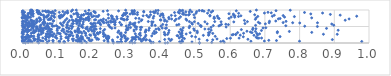
| Category | Series 0 |
|---|---|
| 0.5119025877408926 | 0.001 |
| 0.4126539866589853 | 0.002 |
| 0.009565070195917147 | 0.003 |
| 0.5110437259262518 | 0.004 |
| 0.26343760605690314 | 0.005 |
| 0.04818512540377783 | 0.006 |
| 0.31847032164182726 | 0.007 |
| 0.4196648750307523 | 0.008 |
| 0.37221815655606694 | 0.009 |
| 0.3252234285979464 | 0.01 |
| 0.4578985301840214 | 0.011 |
| 0.1725142587305596 | 0.012 |
| 0.0037070343712594517 | 0.013 |
| 0.0728381030565067 | 0.014 |
| 0.18586488468396364 | 0.015 |
| 0.5468149584931802 | 0.016 |
| 0.3110965996179899 | 0.017 |
| 0.3782162829624918 | 0.018 |
| 0.018305680623724792 | 0.019 |
| 0.07234310696253618 | 0.02 |
| 0.27947726100723885 | 0.021 |
| 0.5829646561322925 | 0.022 |
| 0.12295013277099939 | 0.023 |
| 0.274148199250739 | 0.024 |
| 0.24808586120000017 | 0.025 |
| 0.10850868623535385 | 0.026 |
| 0.1203393513211631 | 0.027 |
| 0.0896639272993858 | 0.028 |
| 0.28689535963270074 | 0.029 |
| 0.02921057819102696 | 0.03 |
| 0.16715190988454232 | 0.031 |
| 0.48984421801418226 | 0.032 |
| 0.04484551768862694 | 0.033 |
| 0.01579565165165343 | 0.034 |
| 0.4542212703960004 | 0.035 |
| 0.025391776370436273 | 0.036 |
| 0.016611433516440854 | 0.037 |
| 0.4627031396345181 | 0.038 |
| 0.16830707266852046 | 0.039 |
| 0.39629480736686873 | 0.04 |
| 0.5727819457750162 | 0.041 |
| 0.16057743324149176 | 0.042 |
| 0.285822041818848 | 0.043 |
| 0.12163234444274439 | 0.044 |
| 0.9790710817109156 | 0.045 |
| 0.3445888609127008 | 0.046 |
| 0.26216488195021453 | 0.047 |
| 0.37046815945160294 | 0.048 |
| 0.0016464650899225299 | 0.049 |
| 0.10656667648574371 | 0.05 |
| 0.006076138489974972 | 0.051 |
| 0.29850312595106554 | 0.052 |
| 0.6596730757829257 | 0.053 |
| 0.7997433507426633 | 0.054 |
| 0.10856643164775959 | 0.055 |
| 0.24748910148861322 | 0.056 |
| 0.4608443652437571 | 0.057 |
| 0.06047659159965289 | 0.058 |
| 0.6985067056871446 | 0.059 |
| 0.005953391851341842 | 0.06 |
| 0.0013565403542534341 | 0.061 |
| 0.5796616221465702 | 0.062 |
| 0.1804670981968877 | 0.063 |
| 0.019672254525324374 | 0.064 |
| 0.19841442980352123 | 0.065 |
| 0.1647067813303495 | 0.066 |
| 0.054708043080989394 | 0.067 |
| 0.14738743690725672 | 0.068 |
| 0.08935802420370768 | 0.069 |
| 0.07789127826838671 | 0.07 |
| 0.2367691939130765 | 0.071 |
| 0.4279017837008784 | 0.072 |
| 0.001234815517246652 | 0.073 |
| 0.7333494051140961 | 0.074 |
| 0.1333625994295932 | 0.075 |
| 0.1556380530285394 | 0.076 |
| 0.31589857928697695 | 0.077 |
| 0.08907305338222854 | 0.078 |
| 0.03489830999570762 | 0.079 |
| 0.19476019123073157 | 0.08 |
| 0.7112491979636713 | 0.081 |
| 0.5337613130346864 | 0.082 |
| 0.4613010239611775 | 0.083 |
| 0.36767456002003196 | 0.084 |
| 0.024291158913326137 | 0.085 |
| 0.19353175272078613 | 0.086 |
| 0.35659216999408416 | 0.087 |
| 0.0504433772494215 | 0.088 |
| 0.037685639439198455 | 0.089 |
| 0.2019842502042744 | 0.09 |
| 0.0022177023693992896 | 0.091 |
| 0.26083696338702 | 0.092 |
| 0.30212136470536155 | 0.093 |
| 0.3490182135243095 | 0.094 |
| 0.03702994257538821 | 0.095 |
| 0.5496973995938144 | 0.096 |
| 0.16431018351470741 | 0.097 |
| 0.00936817803683666 | 0.098 |
| 0.17103427520904388 | 0.099 |
| 0.3423506517497918 | 0.1 |
| 0.35878481380429406 | 0.101 |
| 0.2466917180414053 | 0.102 |
| 0.8944369424244668 | 0.103 |
| 0.06924895719642772 | 0.104 |
| 0.32726675822444207 | 0.105 |
| 0.43122927210652023 | 0.106 |
| 0.41127632143356513 | 0.107 |
| 0.019184857617721398 | 0.108 |
| 0.04431614382526744 | 0.109 |
| 0.28511302120442533 | 0.11 |
| 0.21589934618522266 | 0.111 |
| 0.2206314947919599 | 0.112 |
| 0.6510553493207257 | 0.113 |
| 0.011408317524876598 | 0.114 |
| 0.1618849035566547 | 0.115 |
| 0.3195991598963953 | 0.116 |
| 0.5105287988795942 | 0.117 |
| 0.3375737268340092 | 0.118 |
| 0.1754787284788721 | 0.119 |
| 0.14525638391060747 | 0.12 |
| 0.046558848661996347 | 0.121 |
| 0.14829771224872174 | 0.122 |
| 0.5620073145155606 | 0.123 |
| 0.30055819434844294 | 0.124 |
| 0.42327753017190967 | 0.125 |
| 0.11259605728469026 | 0.126 |
| 0.03651286200454346 | 0.127 |
| 0.0678462303275696 | 0.128 |
| 0.13300506415104935 | 0.129 |
| 0.35029162363015987 | 0.13 |
| 0.3402792603256351 | 0.131 |
| 0.3047734682660579 | 0.132 |
| 0.46808479414933096 | 0.133 |
| 0.5901718343891207 | 0.134 |
| 0.03350304918064729 | 0.135 |
| 0.35128403105923384 | 0.136 |
| 0.24866063459613566 | 0.137 |
| 0.002175744603686815 | 0.138 |
| 0.2169820490102558 | 0.139 |
| 0.243396539881631 | 0.14 |
| 0.32363610158967593 | 0.141 |
| 0.16574320402932008 | 0.142 |
| 0.10037754382586764 | 0.143 |
| 0.19315776367517873 | 0.144 |
| 0.6008149948747821 | 0.145 |
| 0.17249901423390793 | 0.146 |
| 0.6825538331252522 | 0.147 |
| 0.6256434530778168 | 0.148 |
| 0.2969572194009828 | 0.149 |
| 0.6779118630819716 | 0.15 |
| 0.6904783352809722 | 0.151 |
| 0.32561454310275517 | 0.152 |
| 0.45317856173937 | 0.153 |
| 0.05988923456390162 | 0.154 |
| 0.18870209021765158 | 0.155 |
| 0.25008428494351215 | 0.156 |
| 0.1707601973236729 | 0.157 |
| 0.010969449563899175 | 0.158 |
| 0.011510134957108684 | 0.159 |
| 0.000634772903669578 | 0.16 |
| 0.32146519776981475 | 0.161 |
| 0.048131820807391486 | 0.162 |
| 0.1294279070607893 | 0.163 |
| 0.4629860186901766 | 0.164 |
| 0.31746814972877174 | 0.165 |
| 0.12654097333734443 | 0.166 |
| 0.015963590846686394 | 0.167 |
| 0.077590350434737 | 0.168 |
| 0.015093066693773978 | 0.169 |
| 0.022567888732393526 | 0.17 |
| 0.24335558166347268 | 0.171 |
| 0.21133650093689743 | 0.172 |
| 0.008509884561067107 | 0.173 |
| 0.09583245536882434 | 0.174 |
| 0.6751061256750083 | 0.175 |
| 0.3349269679017548 | 0.176 |
| 0.2882341894508651 | 0.177 |
| 0.27572822288756726 | 0.178 |
| 0.17422953321207452 | 0.179 |
| 0.1581148729453198 | 0.18 |
| 0.0017424470095674545 | 0.181 |
| 0.017451511756296743 | 0.182 |
| 0.32812639666877363 | 0.183 |
| 0.15920163837227053 | 0.184 |
| 0.5001576625644056 | 0.185 |
| 0.1334470557814857 | 0.186 |
| 0.010561033039289652 | 0.187 |
| 0.6378051133069329 | 0.188 |
| 0.07181401330751351 | 0.189 |
| 0.355350693647943 | 0.19 |
| 0.3287728596513116 | 0.191 |
| 0.24987419152793955 | 0.192 |
| 0.06999707294775914 | 0.193 |
| 0.7437056594063286 | 0.194 |
| 0.4582626013621017 | 0.195 |
| 0.11222389191679469 | 0.196 |
| 0.0004094471046502594 | 0.197 |
| 0.29704878189023626 | 0.198 |
| 0.06829277579353878 | 0.199 |
| 0.23535272719405595 | 0.2 |
| 0.02885492335061019 | 0.201 |
| 0.5568066794734551 | 0.202 |
| 0.08893670172724344 | 0.203 |
| 0.48918071617833 | 0.204 |
| 0.04605715228672384 | 0.205 |
| 0.034193374601481044 | 0.206 |
| 0.17077007647185646 | 0.207 |
| 0.1609634303104892 | 0.208 |
| 0.24775334432427526 | 0.209 |
| 0.32893969138008683 | 0.21 |
| 0.13672651494532534 | 0.211 |
| 0.020110833533931973 | 0.212 |
| 0.28606152891036085 | 0.213 |
| 0.3738828906497835 | 0.214 |
| 0.025860534814779033 | 0.215 |
| 0.02658701137931254 | 0.216 |
| 0.08229236357473423 | 0.217 |
| 0.44936067356709053 | 0.218 |
| 0.14664094945386152 | 0.219 |
| 0.078304741175579 | 0.22 |
| 0.15942076680695513 | 0.221 |
| 0.44688629968107707 | 0.222 |
| 0.09788297940522495 | 0.223 |
| 0.13880042345691715 | 0.224 |
| 0.4617195260707267 | 0.225 |
| 0.21159388410347926 | 0.226 |
| 0.24014334994346037 | 0.227 |
| 0.18411029880315963 | 0.228 |
| 0.34165904285021714 | 0.229 |
| 0.2937941573973862 | 0.23 |
| 0.19779035479122012 | 0.231 |
| 0.5226439983433782 | 0.232 |
| 0.6685328697633524 | 0.233 |
| 0.04859044073026692 | 0.234 |
| 0.5376881155498591 | 0.235 |
| 0.08806487028936098 | 0.236 |
| 0.35690907987920967 | 0.237 |
| 0.6290411551457933 | 0.238 |
| 0.01635333483061353 | 0.239 |
| 0.1396870174083389 | 0.24 |
| 0.08300653029646834 | 0.241 |
| 0.6788843607868364 | 0.242 |
| 0.41257128233706925 | 0.243 |
| 0.23938473791691262 | 0.244 |
| 0.04953939197256884 | 0.245 |
| 0.6054033873471087 | 0.246 |
| 0.0848530957636437 | 0.247 |
| 0.19540722660060675 | 0.248 |
| 0.15885289725910082 | 0.249 |
| 0.1359016842380897 | 0.25 |
| 0.04736478461801026 | 0.251 |
| 0.20825882559556472 | 0.252 |
| 0.015097992891398179 | 0.253 |
| 0.4114345386220272 | 0.254 |
| 0.047341125564339316 | 0.255 |
| 0.615787714321102 | 0.256 |
| 0.608608995438262 | 0.257 |
| 0.07261461626549706 | 0.258 |
| 0.0037092628443344392 | 0.259 |
| 0.4197337137702663 | 0.26 |
| 0.5385244127317804 | 0.261 |
| 0.12870722507320292 | 0.262 |
| 0.6158882950862178 | 0.263 |
| 0.9084582696357356 | 0.264 |
| 0.8686328156433936 | 0.265 |
| 0.4111217828533446 | 0.266 |
| 0.3378344836950024 | 0.267 |
| 0.08019275508652228 | 0.268 |
| 0.23451624136996813 | 0.269 |
| 0.05542225644329267 | 0.27 |
| 0.2859997025382632 | 0.271 |
| 0.45681433683045963 | 0.272 |
| 0.47313437390219715 | 0.273 |
| 0.10979007905057604 | 0.274 |
| 0.2198310927938417 | 0.275 |
| 0.06972292640425558 | 0.276 |
| 0.684582309048272 | 0.277 |
| 0.2820052518222499 | 0.278 |
| 0.3265573601942448 | 0.279 |
| 0.12575853301448808 | 0.28 |
| 0.0921986203524551 | 0.281 |
| 0.07523479873742782 | 0.282 |
| 0.10966145839791895 | 0.283 |
| 0.21690603127646965 | 0.284 |
| 0.003041274448268504 | 0.285 |
| 0.20724089320595857 | 0.286 |
| 0.38221944033213073 | 0.287 |
| 0.6767941329025524 | 0.288 |
| 0.18277274220359033 | 0.289 |
| 0.37730452201460235 | 0.29 |
| 0.5498374390066204 | 0.291 |
| 0.45929689717699257 | 0.292 |
| 0.17267062664732796 | 0.293 |
| 0.6385926261290008 | 0.294 |
| 0.02666965647037719 | 0.295 |
| 0.10545570669132319 | 0.296 |
| 0.1434974990030883 | 0.297 |
| 0.0002648203481736067 | 0.298 |
| 0.10240622116886718 | 0.299 |
| 0.4612595828787801 | 0.3 |
| 0.1832593185785308 | 0.301 |
| 0.34059213466303684 | 0.302 |
| 0.21744186823131226 | 0.303 |
| 0.034350206548688464 | 0.304 |
| 0.2348164054516113 | 0.305 |
| 0.28534650953340435 | 0.306 |
| 0.21799865106841554 | 0.307 |
| 0.060417650513532054 | 0.308 |
| 0.5375323528958009 | 0.309 |
| 0.505345074809969 | 0.31 |
| 0.7358413547008256 | 0.311 |
| 0.4845688600631314 | 0.312 |
| 0.6628374982208357 | 0.313 |
| 0.42246363038744766 | 0.314 |
| 0.16416718044762035 | 0.315 |
| 0.621363357989958 | 0.316 |
| 0.08108032838674557 | 0.317 |
| 0.29832295552183413 | 0.318 |
| 0.030251744719909095 | 0.319 |
| 0.22435624291824532 | 0.32 |
| 0.3869742491046855 | 0.321 |
| 0.8349921600626847 | 0.322 |
| 0.4101883012805646 | 0.323 |
| 0.2763129423719349 | 0.324 |
| 0.5416301655421153 | 0.325 |
| 0.35520314739228687 | 0.326 |
| 0.0152343085936756 | 0.327 |
| 0.14180216196875486 | 0.328 |
| 0.16152528690430418 | 0.329 |
| 0.12090002591049649 | 0.33 |
| 0.22513693809405147 | 0.331 |
| 0.08642359507752541 | 0.332 |
| 0.6582756085474463 | 0.333 |
| 0.001399626325250455 | 0.334 |
| 0.4527185062061699 | 0.335 |
| 0.16935116851072637 | 0.336 |
| 0.15346751867697958 | 0.337 |
| 0.03495626838817911 | 0.338 |
| 0.055466286403926174 | 0.339 |
| 0.037537518315668275 | 0.34 |
| 0.13321844687074277 | 0.341 |
| 0.736013128202757 | 0.342 |
| 0.006864084755586312 | 0.343 |
| 0.1393781493040843 | 0.344 |
| 0.07376919352349569 | 0.345 |
| 0.056447604624395464 | 0.346 |
| 0.20859234375638613 | 0.347 |
| 0.16147497000465205 | 0.348 |
| 0.3559202495919378 | 0.349 |
| 0.7704546456594943 | 0.35 |
| 0.6727039984287759 | 0.351 |
| 0.17854569251584557 | 0.352 |
| 0.017235374896973205 | 0.353 |
| 0.381262984285593 | 0.354 |
| 0.04854451704879168 | 0.355 |
| 0.15502561102072857 | 0.356 |
| 0.6482444465606437 | 0.357 |
| 0.505035530985839 | 0.358 |
| 0.0023876020571259433 | 0.359 |
| 0.20250939844900454 | 0.36 |
| 0.1291899217069096 | 0.361 |
| 0.3231530579167611 | 0.362 |
| 0.46096349873190307 | 0.363 |
| 0.19164709403144212 | 0.364 |
| 0.152494113873365 | 0.365 |
| 0.2787078919743129 | 0.366 |
| 0.08075487833713073 | 0.367 |
| 0.03933452390075098 | 0.368 |
| 0.009866969920087511 | 0.369 |
| 0.23434469942188307 | 0.37 |
| 0.041099834656729436 | 0.371 |
| 0.016936966042778123 | 0.372 |
| 0.11487108880088974 | 0.373 |
| 0.35706023100677275 | 0.374 |
| 0.003817160134326135 | 0.375 |
| 0.061280624625293496 | 0.376 |
| 0.02119686439829206 | 0.377 |
| 0.6899873137264857 | 0.378 |
| 0.10149338470921843 | 0.379 |
| 0.4236532475713053 | 0.38 |
| 0.16342269391453854 | 0.381 |
| 0.4617342693364552 | 0.382 |
| 0.2073815140779814 | 0.383 |
| 0.4967979850893599 | 0.384 |
| 0.011188034589063608 | 0.385 |
| 0.3655030199314582 | 0.386 |
| 0.9111040774311845 | 0.387 |
| 0.05420528049050486 | 0.388 |
| 0.016051689586159545 | 0.389 |
| 0.5451701809489183 | 0.39 |
| 0.033449197109880514 | 0.391 |
| 0.05116341986218598 | 0.392 |
| 0.1998119466610441 | 0.393 |
| 0.016783342468885177 | 0.394 |
| 0.3229951153416494 | 0.395 |
| 0.30244040841129205 | 0.396 |
| 0.04870789144958133 | 0.397 |
| 0.3572503183947781 | 0.398 |
| 0.07644700577471909 | 0.399 |
| 0.025244600835683008 | 0.4 |
| 0.34172922751923607 | 0.401 |
| 0.3007559921670924 | 0.402 |
| 0.2079439287879211 | 0.403 |
| 0.12030030223746355 | 0.404 |
| 0.0021778973867751573 | 0.405 |
| 0.6322055057857713 | 0.406 |
| 0.39504324579080174 | 0.407 |
| 0.6646443769147434 | 0.408 |
| 0.3051790285139276 | 0.409 |
| 0.23814846066662718 | 0.41 |
| 0.012522708436066513 | 0.411 |
| 0.060121102954758254 | 0.412 |
| 0.16083348459789695 | 0.413 |
| 0.08494250527833493 | 0.414 |
| 0.45733976968642553 | 0.415 |
| 0.016481263622723837 | 0.416 |
| 0.20813085655112068 | 0.417 |
| 0.18790171475178008 | 0.418 |
| 0.38607910988482735 | 0.419 |
| 0.21381011809164166 | 0.42 |
| 0.5378280875495637 | 0.421 |
| 0.08093891957767563 | 0.422 |
| 0.32958947303038627 | 0.423 |
| 0.5270079719103179 | 0.424 |
| 0.11771438844446999 | 0.425 |
| 0.21020941244225297 | 0.426 |
| 0.10201607455340203 | 0.427 |
| 0.4949310825144498 | 0.428 |
| 0.1347632439413392 | 0.429 |
| 0.04152653394231292 | 0.43 |
| 0.1637221985143313 | 0.431 |
| 0.19528678944353 | 0.432 |
| 0.674106183091517 | 0.433 |
| 0.07087757597298121 | 0.434 |
| 0.07856145275751708 | 0.435 |
| 0.2256539610422358 | 0.436 |
| 0.06759523297045913 | 0.437 |
| 0.14285245275920094 | 0.438 |
| 0.06033461841585103 | 0.439 |
| 0.39307910455996115 | 0.44 |
| 0.04480798396259616 | 0.441 |
| 0.18379275080695387 | 0.442 |
| 0.8775777111136971 | 0.443 |
| 0.2589363164141588 | 0.444 |
| 0.41356108365169725 | 0.445 |
| 0.16165466184821847 | 0.446 |
| 0.6654380147494998 | 0.447 |
| 0.0544339824790113 | 0.448 |
| 0.0075434627764937616 | 0.449 |
| 0.36688386988956767 | 0.45 |
| 0.30246962121540044 | 0.451 |
| 0.41625060372894135 | 0.452 |
| 0.40433042148692555 | 0.453 |
| 0.030037413645071207 | 0.454 |
| 0.6945513420017883 | 0.455 |
| 0.13484903168236695 | 0.456 |
| 0.2681767002112646 | 0.457 |
| 0.06522471693725095 | 0.458 |
| 0.4645047254388044 | 0.459 |
| 0.03258641240373043 | 0.46 |
| 0.053095544209165055 | 0.461 |
| 0.7027166227109121 | 0.462 |
| 0.10760853804880795 | 0.463 |
| 0.481881749344008 | 0.464 |
| 0.04365929605174955 | 0.465 |
| 0.1285526040197429 | 0.466 |
| 0.3128080279760649 | 0.467 |
| 0.30716761420157324 | 0.468 |
| 0.054371108849126 | 0.469 |
| 0.17526548181605417 | 0.47 |
| 0.3411816591878207 | 0.471 |
| 0.07661540465742397 | 0.472 |
| 0.5447138858335147 | 0.473 |
| 0.02945160129042038 | 0.474 |
| 0.34466082838096473 | 0.475 |
| 0.2543655813098325 | 0.476 |
| 0.002781493390021903 | 0.477 |
| 0.1291973008235955 | 0.478 |
| 0.007221373105458038 | 0.479 |
| 0.2024016482095336 | 0.48 |
| 0.20062728254044726 | 0.481 |
| 0.18789113484764905 | 0.482 |
| 0.01777542895111595 | 0.483 |
| 0.20121804458563783 | 0.484 |
| 0.5883265017633058 | 0.485 |
| 0.1992526875269352 | 0.486 |
| 0.3302446132343225 | 0.487 |
| 0.03094632198391362 | 0.488 |
| 0.016433444168173935 | 0.489 |
| 0.325913338434521 | 0.49 |
| 0.004862630239668517 | 0.491 |
| 0.0745118293988425 | 0.492 |
| 0.04083064023991616 | 0.493 |
| 0.04344018380055098 | 0.494 |
| 0.2526594031753545 | 0.495 |
| 0.145785222225389 | 0.496 |
| 0.17149460492770244 | 0.497 |
| 0.10237089573268382 | 0.498 |
| 0.5161635147486351 | 0.499 |
| 0.8512288364114696 | 0.5 |
| 0.20882069157666608 | 0.501 |
| 0.14497557408836817 | 0.502 |
| 0.020515341736702084 | 0.503 |
| 0.06998883549552534 | 0.504 |
| 0.20516054260563507 | 0.505 |
| 0.008125808134776836 | 0.506 |
| 0.08834525775312733 | 0.507 |
| 0.21185803614552728 | 0.508 |
| 0.8147760725973411 | 0.509 |
| 0.4830976954002983 | 0.51 |
| 0.4004622640326524 | 0.511 |
| 0.03371539695690574 | 0.512 |
| 0.30044785370990257 | 0.513 |
| 0.09228575334590165 | 0.514 |
| 0.07438669474136972 | 0.515 |
| 0.023229277108440128 | 0.516 |
| 0.5674198701176871 | 0.517 |
| 0.05184560427259476 | 0.518 |
| 0.13992555700975184 | 0.519 |
| 0.5159634637167063 | 0.52 |
| 0.17189947355133428 | 0.521 |
| 0.1635270160371911 | 0.522 |
| 0.7603523217637737 | 0.523 |
| 0.016504887313659802 | 0.524 |
| 0.0008887716860405292 | 0.525 |
| 0.09847902268960723 | 0.526 |
| 0.08733921930685155 | 0.527 |
| 0.5512206136905444 | 0.528 |
| 0.032701731498771903 | 0.529 |
| 0.1177063735889306 | 0.53 |
| 0.5136579719969685 | 0.531 |
| 0.02651844997811519 | 0.532 |
| 0.37404696894008577 | 0.533 |
| 0.383890302284335 | 0.534 |
| 0.6731611594237886 | 0.535 |
| 0.13066794446934493 | 0.536 |
| 0.5707524460521933 | 0.537 |
| 0.24964877977232153 | 0.538 |
| 0.8985048384331639 | 0.539 |
| 0.01508079601105445 | 0.54 |
| 0.07277302284641207 | 0.541 |
| 0.32413215976887605 | 0.542 |
| 0.1298480987475435 | 0.543 |
| 0.3234370704070773 | 0.544 |
| 0.30810903686156726 | 0.545 |
| 0.44608430868448334 | 0.546 |
| 0.03069741887815056 | 0.547 |
| 0.4161494964240467 | 0.548 |
| 0.05475604304116135 | 0.549 |
| 0.0632977719703333 | 0.55 |
| 0.2857323042574735 | 0.551 |
| 0.2680546268259798 | 0.552 |
| 0.22665023577971638 | 0.553 |
| 0.2501775315261669 | 0.554 |
| 0.2868048761358317 | 0.555 |
| 0.021975160347029708 | 0.556 |
| 0.5947629214218213 | 0.557 |
| 0.12954233136119467 | 0.558 |
| 0.010907640907357994 | 0.559 |
| 0.11424440292863632 | 0.56 |
| 0.4521144587428363 | 0.561 |
| 0.40567568265051357 | 0.562 |
| 0.03711960862446037 | 0.563 |
| 0.5748055146880731 | 0.564 |
| 0.3110629390575425 | 0.565 |
| 0.02981009047206582 | 0.566 |
| 0.17586423127007306 | 0.567 |
| 0.004334310546971132 | 0.568 |
| 0.5873863508035803 | 0.569 |
| 0.26719050306134984 | 0.57 |
| 0.20431088032634662 | 0.571 |
| 0.4910705452878402 | 0.572 |
| 0.3182523361921545 | 0.573 |
| 0.20160559215302626 | 0.574 |
| 0.8926110417871895 | 0.575 |
| 0.033461182207861886 | 0.576 |
| 0.3746334741681611 | 0.577 |
| 0.00180098233260313 | 0.578 |
| 0.16607911604840073 | 0.579 |
| 0.7013486792437984 | 0.58 |
| 0.5336778596576254 | 0.581 |
| 0.3221126867257388 | 0.582 |
| 0.15749310974844832 | 0.583 |
| 0.08648059708759845 | 0.584 |
| 0.07417491389510074 | 0.585 |
| 0.14462354624766666 | 0.586 |
| 0.21146400261443993 | 0.587 |
| 0.08063672278745616 | 0.588 |
| 0.6425117996900976 | 0.589 |
| 0.22438947847782023 | 0.59 |
| 0.14800838370767097 | 0.591 |
| 0.03377964575759851 | 0.592 |
| 0.5076887622582814 | 0.593 |
| 0.1981398652102093 | 0.594 |
| 0.021919847210912086 | 0.595 |
| 0.028199215330484258 | 0.596 |
| 0.22395197808650927 | 0.597 |
| 0.6854693458514062 | 0.598 |
| 0.01793199858793693 | 0.599 |
| 0.11092211584452301 | 0.6 |
| 0.06669268994965362 | 0.601 |
| 0.20712938937324166 | 0.602 |
| 0.0019719305772069947 | 0.603 |
| 0.059654440982426615 | 0.604 |
| 0.48881980808402015 | 0.605 |
| 0.06113110584735408 | 0.606 |
| 0.8004509590277683 | 0.607 |
| 0.15962847226587304 | 0.608 |
| 0.3257646704992114 | 0.609 |
| 0.018050422360845163 | 0.61 |
| 0.23589461333320455 | 0.611 |
| 0.8515190692153647 | 0.612 |
| 0.7123553661041809 | 0.613 |
| 0.7800359212132929 | 0.614 |
| 0.013108906902420205 | 0.615 |
| 0.2437278628655846 | 0.616 |
| 0.31166045997408537 | 0.617 |
| 0.21883501952330403 | 0.618 |
| 0.7525752876856481 | 0.619 |
| 0.0409144162962448 | 0.62 |
| 0.1199924598440301 | 0.621 |
| 0.28167856588186146 | 0.622 |
| 0.04217700214319442 | 0.623 |
| 0.13237889215392448 | 0.624 |
| 0.061655033630296646 | 0.625 |
| 0.06529378943025309 | 0.626 |
| 0.6811408095468146 | 0.627 |
| 0.25633151810845956 | 0.628 |
| 0.26866432624260445 | 0.629 |
| 0.02895383882514682 | 0.63 |
| 0.3367770408363697 | 0.631 |
| 0.02065117333314252 | 0.632 |
| 0.12062786119194596 | 0.633 |
| 0.0328815681568438 | 0.634 |
| 0.2489371564486788 | 0.635 |
| 0.23316471564217162 | 0.636 |
| 0.009767776606807495 | 0.637 |
| 0.17675961372463875 | 0.638 |
| 0.6103676005829145 | 0.639 |
| 0.377735770125877 | 0.64 |
| 0.3737180963554378 | 0.641 |
| 0.5270558364990511 | 0.642 |
| 0.5736727826802192 | 0.643 |
| 0.4966784519552093 | 0.644 |
| 0.26267928387188316 | 0.645 |
| 0.2624578935247974 | 0.646 |
| 0.649570209826908 | 0.647 |
| 0.4824581570508458 | 0.648 |
| 0.5554647727325513 | 0.649 |
| 0.0011991425044818168 | 0.65 |
| 0.3639860634244314 | 0.651 |
| 0.23406948543970427 | 0.652 |
| 0.16487708941147444 | 0.653 |
| 0.4176226330865687 | 0.654 |
| 0.16755998007922085 | 0.655 |
| 0.7609093307076606 | 0.656 |
| 0.05003634795712376 | 0.657 |
| 0.04269212479000982 | 0.658 |
| 0.7132202745315991 | 0.659 |
| 0.09023349572021676 | 0.66 |
| 0.1477717561530883 | 0.661 |
| 0.06377989616023219 | 0.662 |
| 0.0029672827021058334 | 0.663 |
| 0.005283331739317353 | 0.664 |
| 0.15521900018066181 | 0.665 |
| 0.7313871513795225 | 0.666 |
| 0.034580218884701176 | 0.667 |
| 0.4107977661918043 | 0.668 |
| 0.15526882717124987 | 0.669 |
| 0.25535230060029457 | 0.67 |
| 0.029546793235916944 | 0.671 |
| 0.1625430804723346 | 0.672 |
| 0.2219920262600012 | 0.673 |
| 0.14806809275603386 | 0.674 |
| 0.2685666854970543 | 0.675 |
| 0.44006902781225193 | 0.676 |
| 0.3435876021747725 | 0.677 |
| 0.09115750454789942 | 0.678 |
| 0.02621604767322211 | 0.679 |
| 0.22932753026944533 | 0.68 |
| 0.13658090574327583 | 0.681 |
| 0.16086129377248373 | 0.682 |
| 0.19259463200036356 | 0.683 |
| 0.16784802473392132 | 0.684 |
| 0.640993495078941 | 0.685 |
| 0.12468240123196761 | 0.686 |
| 0.027135785430455348 | 0.687 |
| 0.4750387422268574 | 0.688 |
| 0.012958248993146784 | 0.689 |
| 0.04219877902007154 | 0.69 |
| 0.9314000586749029 | 0.691 |
| 0.015652296253199822 | 0.692 |
| 0.2422977113397788 | 0.693 |
| 0.2945653895341419 | 0.694 |
| 0.4005476672534912 | 0.695 |
| 0.22736935441402747 | 0.696 |
| 0.025523137864823908 | 0.697 |
| 0.05388401456926864 | 0.698 |
| 0.3985834898518054 | 0.699 |
| 0.2090666912033722 | 0.7 |
| 0.19166311598427238 | 0.701 |
| 0.1445697227279166 | 0.702 |
| 0.1837177241452626 | 0.703 |
| 0.34551484291664974 | 0.704 |
| 0.2122737557513951 | 0.705 |
| 0.06288610519821913 | 0.706 |
| 0.41143952063315775 | 0.707 |
| 0.07557770986055087 | 0.708 |
| 0.16735897061921604 | 0.709 |
| 0.17799699116071666 | 0.71 |
| 0.2938819273885025 | 0.711 |
| 0.08067716838639453 | 0.712 |
| 0.29213495438125187 | 0.713 |
| 0.30209833023582044 | 0.714 |
| 0.1770580219953459 | 0.715 |
| 0.07737779525636003 | 0.716 |
| 0.3037586737352349 | 0.717 |
| 0.6724577678535893 | 0.718 |
| 0.1559860789320192 | 0.719 |
| 0.04255692758553022 | 0.72 |
| 0.4439202197671891 | 0.721 |
| 0.013045228328405746 | 0.722 |
| 0.264098637248372 | 0.723 |
| 0.19191447046629334 | 0.724 |
| 0.47247734635771144 | 0.725 |
| 0.23466408212699166 | 0.726 |
| 0.4312067532780555 | 0.727 |
| 0.08480474006689222 | 0.728 |
| 0.9426608756638202 | 0.729 |
| 0.4234467132157485 | 0.73 |
| 0.28808238969250544 | 0.731 |
| 0.7388099722785652 | 0.732 |
| 0.28852734443643213 | 0.733 |
| 0.08243994361489633 | 0.734 |
| 0.19431651109126374 | 0.735 |
| 0.27426846631381746 | 0.736 |
| 0.1701807561891778 | 0.737 |
| 0.12928309585169753 | 0.738 |
| 0.2593454525241208 | 0.739 |
| 0.5682059394739846 | 0.74 |
| 0.2856484056749165 | 0.741 |
| 0.7438640358605002 | 0.742 |
| 0.05106600561396942 | 0.743 |
| 0.3374771909012174 | 0.744 |
| 0.5963922642682795 | 0.745 |
| 0.4522624318405269 | 0.746 |
| 0.18462221135101467 | 0.747 |
| 0.553388730445805 | 0.748 |
| 0.3277356699684836 | 0.749 |
| 0.052326818266876726 | 0.75 |
| 0.009019309679915773 | 0.751 |
| 0.5544155492505385 | 0.752 |
| 0.3780961342379617 | 0.753 |
| 0.24923788899572538 | 0.754 |
| 0.007557429599568284 | 0.755 |
| 0.0008177192929067425 | 0.756 |
| 0.17119089532545 | 0.757 |
| 0.0012542380046242706 | 0.758 |
| 0.006104024661860046 | 0.759 |
| 0.5647935633461825 | 0.76 |
| 0.8348519267813949 | 0.761 |
| 0.0640251490151296 | 0.762 |
| 0.6749071868713349 | 0.763 |
| 0.10850691998237533 | 0.764 |
| 0.11079395859985341 | 0.765 |
| 0.08285231903271599 | 0.766 |
| 0.04940457935458145 | 0.767 |
| 0.016312320906599148 | 0.768 |
| 0.4972638054039446 | 0.769 |
| 0.25950427612939564 | 0.77 |
| 0.18965286570806003 | 0.771 |
| 0.16619540977622474 | 0.772 |
| 0.0003750267914636393 | 0.773 |
| 0.008254090063414113 | 0.774 |
| 0.010866028885772058 | 0.775 |
| 0.42306463473897743 | 0.776 |
| 0.4074499136165502 | 0.777 |
| 0.09350817003344469 | 0.778 |
| 0.018308987027934362 | 0.779 |
| 0.0246050812671328 | 0.78 |
| 0.02118822047269239 | 0.781 |
| 0.6131827823847666 | 0.782 |
| 0.06999276402844595 | 0.783 |
| 0.5538781354653924 | 0.784 |
| 0.756615307314189 | 0.785 |
| 0.6029440688327964 | 0.786 |
| 0.36426669744959356 | 0.787 |
| 0.14248755854270842 | 0.788 |
| 0.005247220816090491 | 0.789 |
| 0.16073871793317623 | 0.79 |
| 0.06398009846211371 | 0.791 |
| 0.3669431690088451 | 0.792 |
| 0.07209792175139677 | 0.793 |
| 0.4567638929704794 | 0.794 |
| 0.2730911220641428 | 0.795 |
| 0.20190712213155002 | 0.796 |
| 0.30439601019840085 | 0.797 |
| 0.19229067084927276 | 0.798 |
| 0.2189032327175917 | 0.799 |
| 0.7850043953881026 | 0.8 |
| 0.11594641502387706 | 0.801 |
| 0.012461090242397915 | 0.802 |
| 0.6239884273059765 | 0.803 |
| 0.016828917360566388 | 0.804 |
| 0.21367314861855455 | 0.805 |
| 0.6795206681530115 | 0.806 |
| 0.10735955018260236 | 0.807 |
| 0.260194898228366 | 0.808 |
| 0.379784316867482 | 0.809 |
| 0.7215060680224438 | 0.81 |
| 0.09235348056710017 | 0.811 |
| 0.9645635365947578 | 0.812 |
| 0.031980747519888345 | 0.813 |
| 0.07119891056716933 | 0.814 |
| 0.2066962266964484 | 0.815 |
| 0.5631520772441698 | 0.816 |
| 0.5415469692472146 | 0.817 |
| 0.07487531400257405 | 0.818 |
| 0.10810475622194919 | 0.819 |
| 0.17052188692131107 | 0.82 |
| 0.14100499091508403 | 0.821 |
| 0.3980771178671082 | 0.822 |
| 0.2573324955920995 | 0.823 |
| 0.6308605544589155 | 0.824 |
| 0.3491368853787195 | 0.825 |
| 0.6134589917192028 | 0.826 |
| 0.08614975920872617 | 0.827 |
| 0.44150822593938893 | 0.828 |
| 0.11876998846047593 | 0.829 |
| 0.29018218167215815 | 0.83 |
| 0.7526973583971422 | 0.831 |
| 0.06233603248259095 | 0.832 |
| 0.008746518877926802 | 0.833 |
| 0.5416741357912312 | 0.834 |
| 0.3594742516623988 | 0.835 |
| 0.2898793723545322 | 0.836 |
| 0.43048543157935837 | 0.837 |
| 0.22137908752508853 | 0.838 |
| 0.2915401076926841 | 0.839 |
| 0.6103037953081553 | 0.84 |
| 0.4067007943278121 | 0.841 |
| 0.7271464931885764 | 0.842 |
| 0.06157651102914005 | 0.843 |
| 0.9169568618155162 | 0.844 |
| 0.1770967555327736 | 0.845 |
| 0.11303720265058903 | 0.846 |
| 0.17168369912294185 | 0.847 |
| 0.027213028357387953 | 0.848 |
| 0.4799735161583358 | 0.849 |
| 0.07633488146694137 | 0.85 |
| 0.0023031043587857887 | 0.851 |
| 0.49522902407179026 | 0.852 |
| 0.4724498568200291 | 0.853 |
| 0.37049164273126717 | 0.854 |
| 0.67055970293071 | 0.855 |
| 0.15958243757847648 | 0.856 |
| 0.017233307720987415 | 0.857 |
| 0.2977943407888369 | 0.858 |
| 0.1991992424636506 | 0.859 |
| 0.332574495416315 | 0.86 |
| 0.17773228090754767 | 0.861 |
| 0.05601782457319147 | 0.862 |
| 0.05366697448184272 | 0.863 |
| 0.24842873270485158 | 0.864 |
| 0.1623376448420328 | 0.865 |
| 0.8886646957752454 | 0.866 |
| 0.4665520784465878 | 0.867 |
| 0.40129199369715135 | 0.868 |
| 0.12163541027996899 | 0.869 |
| 0.48247786288488353 | 0.87 |
| 0.003802200511570426 | 0.871 |
| 0.40373967554019596 | 0.872 |
| 0.1914240347076312 | 0.873 |
| 0.02701755848864285 | 0.874 |
| 0.19504058586930395 | 0.875 |
| 0.6091525412106698 | 0.876 |
| 0.31141955746156796 | 0.877 |
| 0.31970529076945364 | 0.878 |
| 0.4628276708434548 | 0.879 |
| 0.14923798783903988 | 0.88 |
| 0.8322404169230848 | 0.881 |
| 0.09409132905768389 | 0.882 |
| 0.4050918566638575 | 0.883 |
| 0.03206053519131155 | 0.884 |
| 0.3251869541221089 | 0.885 |
| 0.18998243753650843 | 0.886 |
| 0.5963972228749339 | 0.887 |
| 0.04703710227464427 | 0.888 |
| 0.03183314911115122 | 0.889 |
| 0.1848727182322883 | 0.89 |
| 0.02847186941843875 | 0.891 |
| 0.31900588957206816 | 0.892 |
| 0.1560143346949201 | 0.893 |
| 0.049000195438189696 | 0.894 |
| 0.3914242501745195 | 0.895 |
| 0.01756320019077441 | 0.896 |
| 0.294000122406957 | 0.897 |
| 0.6243540733921732 | 0.898 |
| 0.1901547328709307 | 0.899 |
| 0.19811063682164748 | 0.9 |
| 0.5012551152781115 | 0.901 |
| 0.29974203824844614 | 0.902 |
| 0.004362667444830644 | 0.903 |
| 0.5347494014322957 | 0.904 |
| 0.4537024675461274 | 0.905 |
| 0.0906129747397926 | 0.906 |
| 0.6986645390745208 | 0.907 |
| 0.866224518785469 | 0.908 |
| 0.02247772513253976 | 0.909 |
| 0.13087977369452763 | 0.91 |
| 0.3816450813040098 | 0.911 |
| 0.30196795567832374 | 0.912 |
| 0.05176411944292206 | 0.913 |
| 0.7183584639799084 | 0.914 |
| 0.2112478324300587 | 0.915 |
| 0.08433388188461073 | 0.916 |
| 0.46445137961261485 | 0.917 |
| 0.15840310065925844 | 0.918 |
| 0.13161287112695474 | 0.919 |
| 0.0009269113539452972 | 0.92 |
| 0.3175148173649451 | 0.921 |
| 0.33298466198671833 | 0.922 |
| 0.43964995127945505 | 0.923 |
| 0.022768729055936476 | 0.924 |
| 0.814168229753779 | 0.925 |
| 0.08402108807277847 | 0.926 |
| 0.12522197770065777 | 0.927 |
| 0.10744217776759922 | 0.928 |
| 0.7089001322884739 | 0.929 |
| 0.07706685226443902 | 0.93 |
| 0.45024305676563975 | 0.931 |
| 0.007595315976539718 | 0.932 |
| 0.07971401731429395 | 0.933 |
| 0.5452545155602754 | 0.934 |
| 0.04375346172524147 | 0.935 |
| 0.07191482645846944 | 0.936 |
| 0.04882175528229876 | 0.937 |
| 0.35104884669147085 | 0.938 |
| 0.38447110721327254 | 0.939 |
| 0.48209525894295724 | 0.94 |
| 0.3704562659124295 | 0.941 |
| 0.21033887970839907 | 0.942 |
| 0.04568595918291686 | 0.943 |
| 0.3784917614898349 | 0.944 |
| 0.4893707721036732 | 0.945 |
| 0.07766276680192065 | 0.946 |
| 0.4722234003396919 | 0.947 |
| 0.31806089954169126 | 0.948 |
| 0.028898694380358643 | 0.949 |
| 0.32355555462943236 | 0.95 |
| 0.5036323409393609 | 0.951 |
| 0.0880298450113223 | 0.952 |
| 0.11786782837676399 | 0.953 |
| 0.20704144083070977 | 0.954 |
| 0.031267593652668346 | 0.955 |
| 0.026322696175800936 | 0.956 |
| 0.6578258038155768 | 0.957 |
| 0.3507426190908963 | 0.958 |
| 0.028445202856088512 | 0.959 |
| 0.14231468476525724 | 0.96 |
| 0.2338767290445249 | 0.961 |
| 0.524517092486472 | 0.962 |
| 0.06785860601699914 | 0.963 |
| 0.18231525682916222 | 0.964 |
| 0.05994713052626532 | 0.965 |
| 0.06738260889378928 | 0.966 |
| 0.0009986406558183784 | 0.967 |
| 0.1309483727091984 | 0.968 |
| 0.07495366272729512 | 0.969 |
| 0.5496275631017374 | 0.97 |
| 0.0480501509340357 | 0.971 |
| 0.27832202925191996 | 0.972 |
| 0.0029803387147648752 | 0.973 |
| 0.5186056776521066 | 0.974 |
| 0.6176127949896123 | 0.975 |
| 0.24626727597579384 | 0.976 |
| 0.028406758935160165 | 0.977 |
| 0.4581094942053968 | 0.978 |
| 0.7320230918548385 | 0.979 |
| 0.31704994648788015 | 0.98 |
| 0.09557738021805776 | 0.981 |
| 0.3858295815368563 | 0.982 |
| 0.5202703702871697 | 0.983 |
| 0.32370366518330523 | 0.984 |
| 0.5106656177009823 | 0.985 |
| 0.3923671691023854 | 0.986 |
| 0.029021486055033945 | 0.987 |
| 0.462987802707936 | 0.988 |
| 0.5384303305187393 | 0.989 |
| 0.0433005890722037 | 0.99 |
| 0.1927458638523535 | 0.991 |
| 0.45404083662280414 | 0.992 |
| 0.7730642150601361 | 0.993 |
| 0.29863603086637885 | 0.994 |
| 0.02458157707312912 | 0.995 |
| 0.1564440410755396 | 0.996 |
| 0.4844577934301266 | 0.997 |
| 0.6755343635259364 | 0.998 |
| 0.14567464373152098 | 0.999 |
| 0.02816953279475626 | 1 |